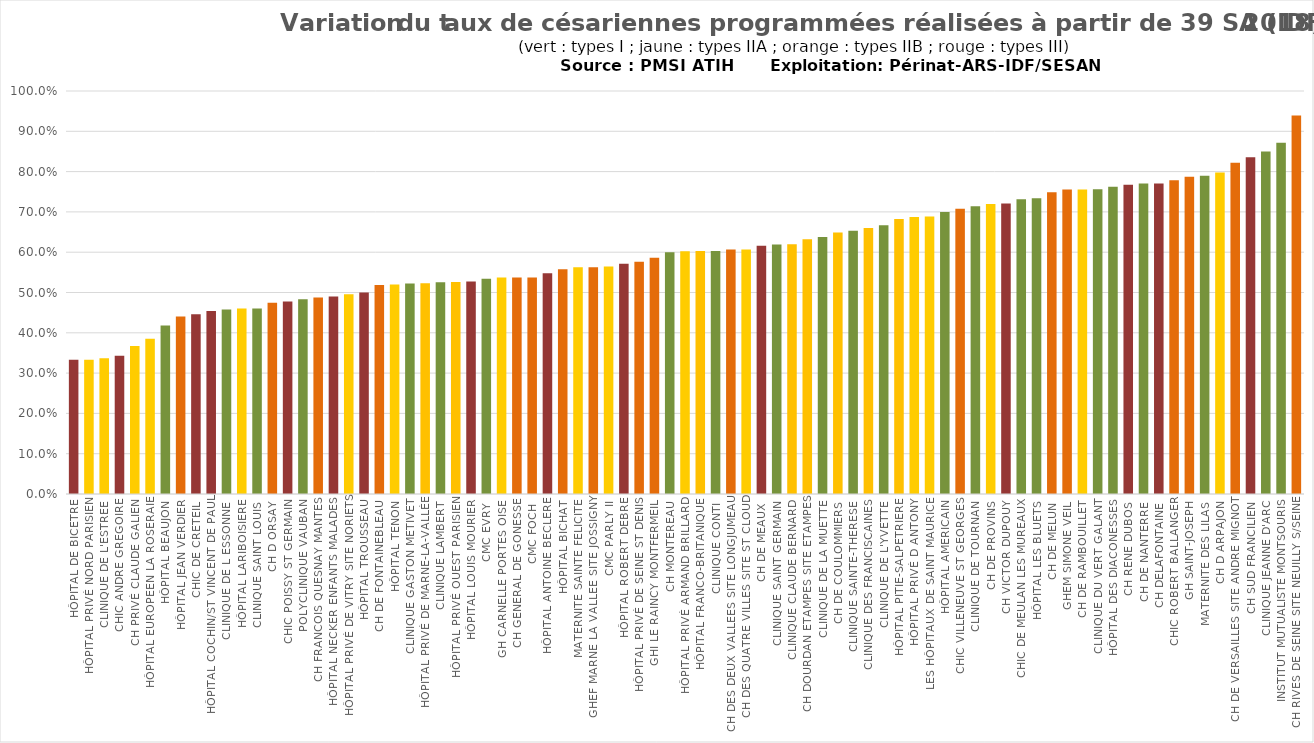
| Category | Tx  ≥ 39 SA |
|---|---|
| HÔPITAL DE BICETRE | 0.333 |
| HÔPITAL PRIVÉ NORD PARISIEN | 0.333 |
| CLINIQUE DE L'ESTREE | 0.337 |
| CHIC ANDRE GREGOIRE | 0.343 |
| CH PRIVÉ CLAUDE GALIEN | 0.367 |
| HÔPITAL EUROPEEN LA ROSERAIE | 0.386 |
| HÔPITAL BEAUJON | 0.418 |
| HÔPITAL JEAN VERDIER | 0.441 |
| CHIC DE CRETEIL | 0.446 |
| HÔPITAL COCHIN/ST VINCENT DE PAUL | 0.454 |
| CLINIQUE DE L ESSONNE | 0.458 |
| HÔPITAL LARIBOISIERE | 0.46 |
| CLINIQUE SAINT LOUIS | 0.461 |
| CH D ORSAY | 0.474 |
| CHIC POISSY ST GERMAIN | 0.478 |
| POLYCLINIQUE VAUBAN | 0.484 |
| CH FRANCOIS QUESNAY MANTES | 0.488 |
| HÔPITAL NECKER ENFANTS MALADES | 0.49 |
| HÔPITAL PRIVÉ DE VITRY SITE NORIETS | 0.496 |
| HÔPITAL TROUSSEAU | 0.5 |
| CH DE FONTAINEBLEAU | 0.519 |
| HÔPITAL TENON | 0.52 |
| CLINIQUE GASTON METIVET | 0.522 |
| HÔPITAL PRIVÉ DE MARNE-LA-VALLÉE | 0.523 |
| CLINIQUE LAMBERT | 0.526 |
| HÔPITAL PRIVÉ OUEST PARISIEN | 0.526 |
| HÔPITAL LOUIS MOURIER | 0.527 |
| CMC EVRY | 0.534 |
| GH CARNELLE PORTES OISE  | 0.537 |
| CH GENERAL DE GONESSE | 0.537 |
| CMC FOCH | 0.537 |
| HÔPITAL ANTOINE BECLERE | 0.548 |
| HÔPITAL BICHAT | 0.558 |
| MATERNITE SAINTE FELICITE | 0.562 |
| GHEF MARNE LA VALLEE SITE JOSSIGNY | 0.563 |
| CMC PARLY II | 0.565 |
| HÔPITAL ROBERT DEBRE | 0.571 |
| HÔPITAL PRIVÉ DE SEINE ST DENIS | 0.577 |
| GHI LE RAINCY MONTFERMEIL | 0.586 |
| CH MONTEREAU | 0.6 |
| HÔPITAL PRIVÉ ARMAND BRILLARD | 0.602 |
| HÔPITAL FRANCO-BRITANIQUE | 0.603 |
| CLINIQUE CONTI | 0.603 |
| CH DES DEUX VALLEES SITE LONGJUMEAU | 0.606 |
| CH DES QUATRE VILLES SITE ST CLOUD | 0.607 |
| CH DE MEAUX | 0.616 |
| CLINIQUE SAINT GERMAIN | 0.619 |
| CLINIQUE CLAUDE BERNARD | 0.62 |
| CH DOURDAN ETAMPES SITE ETAMPES | 0.632 |
| CLINIQUE DE LA MUETTE | 0.638 |
| CH DE COULOMMIERS | 0.649 |
| CLINIQUE SAINTE-THERESE | 0.653 |
| CLINIQUE DES FRANCISCAINES | 0.66 |
| CLINIQUE DE L'YVETTE | 0.667 |
| HÔPITAL PITIE-SALPETRIERE | 0.682 |
| HÔPITAL PRIVÉ D ANTONY | 0.687 |
| LES HÔPITAUX DE SAINT MAURICE | 0.689 |
| HÔPITAL AMERICAIN | 0.7 |
| CHIC VILLENEUVE ST GEORGES | 0.708 |
| CLINIQUE DE TOURNAN | 0.714 |
| CH DE PROVINS | 0.719 |
| CH VICTOR DUPOUY | 0.721 |
| CHIC DE MEULAN LES MUREAUX | 0.731 |
| HÔPITAL LES BLUETS | 0.734 |
| CH DE MELUN | 0.748 |
| GHEM SIMONE VEIL | 0.756 |
| CH DE RAMBOUILLET | 0.756 |
| CLINIQUE DU VERT GALANT | 0.756 |
| HÔPITAL DES DIACONESSES | 0.762 |
| CH RENE DUBOS | 0.768 |
| CH DE NANTERRE | 0.77 |
| CH DELAFONTAINE | 0.771 |
| CHIC ROBERT BALLANGER | 0.779 |
| GH SAINT-JOSEPH | 0.787 |
| MATERNITE DES LILAS | 0.789 |
| CH D ARPAJON | 0.798 |
| CH DE VERSAILLES SITE ANDRE MIGNOT | 0.822 |
| CH SUD FRANCILIEN | 0.836 |
| CLINIQUE JEANNE D'ARC | 0.85 |
| INSTITUT MUTUALISTE MONTSOURIS | 0.872 |
| CH RIVES DE SEINE SITE NEUILLY S/SEINE | 0.939 |